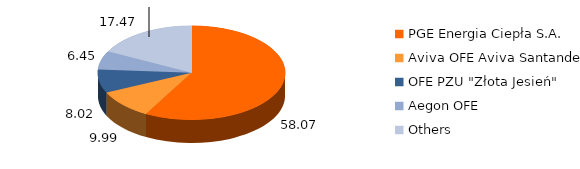
| Category | Series 2 | Series 3 | Series 1 | Series 0 |
|---|---|---|---|---|
| PGE Energia Ciepła S.A. | 58.068 | 58.068 | 8652173 | 8652173 |
| Aviva OFE Aviva Santander | 9.993 | 9.993 | 1489000 | 1489000 |
| OFE PZU "Złota Jesień" | 8.02 | 8.02 | 1195000 | 1195000 |
| Aegon OFE | 6.448 | 6.448 | 960690 | 960690 |
| Others | 17.471 | 17.471 | 2603137 | 2603137 |